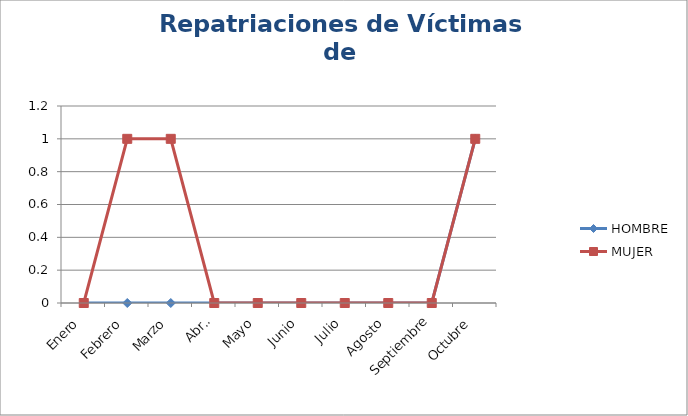
| Category | HOMBRE | MUJER |
|---|---|---|
| Enero | 0 | 0 |
| Febrero | 0 | 1 |
| Marzo | 0 | 1 |
| Abril | 0 | 0 |
| Mayo | 0 | 0 |
| Junio | 0 | 0 |
| Julio | 0 | 0 |
| Agosto | 0 | 0 |
| Septiembre | 0 | 0 |
| Octubre | 1 | 1 |